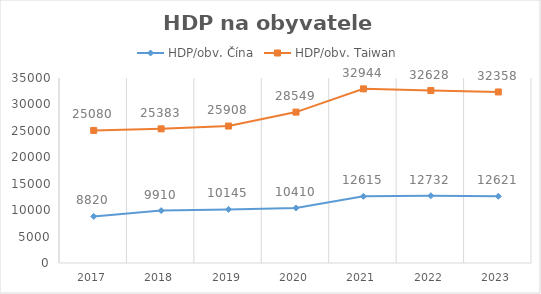
| Category | HDP/obv. Čína | HDP/obv. Taiwan |
|---|---|---|
| 2017.0 | 8820 | 25080 |
| 2018.0 | 9910 | 25383 |
| 2019.0 | 10145 | 25908 |
| 2020.0 | 10410 | 28549 |
| 2021.0 | 12615 | 32944 |
| 2022.0 | 12732 | 32628 |
| 2023.0 | 12621 | 32358 |